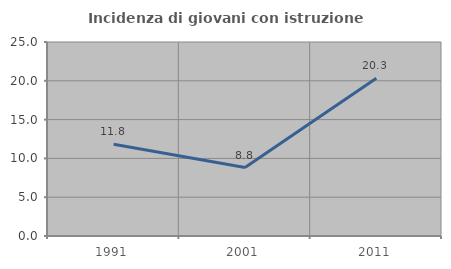
| Category | Incidenza di giovani con istruzione universitaria |
|---|---|
| 1991.0 | 11.828 |
| 2001.0 | 8.824 |
| 2011.0 | 20.339 |